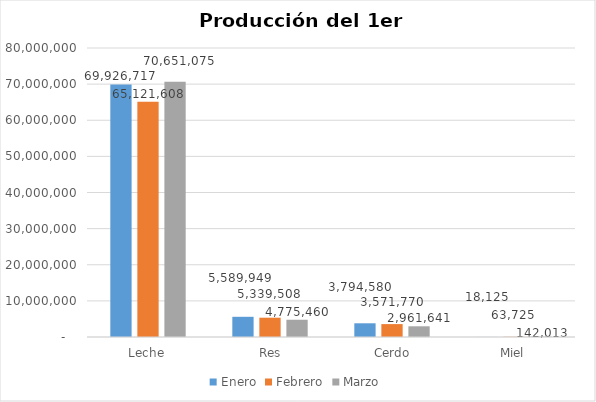
| Category | Enero | Febrero | Marzo |
|---|---|---|---|
| Leche | 69926716.981 | 65121607.547 | 70651075.472 |
|  Res | 5589949.497 | 5339508.301 | 4775460.401 |
|  Cerdo | 3794580.272 | 3571770.389 | 2961640.812 |
| Miel | 18125 | 63725 | 142012.5 |